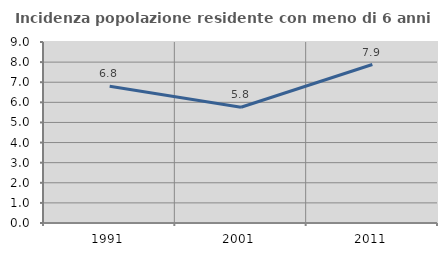
| Category | Incidenza popolazione residente con meno di 6 anni |
|---|---|
| 1991.0 | 6.8 |
| 2001.0 | 5.754 |
| 2011.0 | 7.881 |